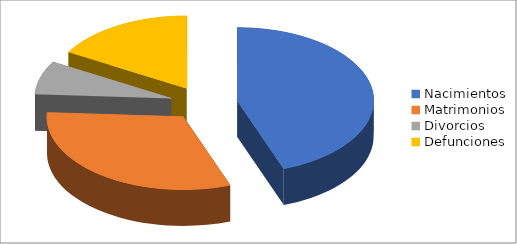
| Category | Series 0 |
|---|---|
| Nacimientos | 24 |
| Matrimonios | 17 |
| Divorcios | 4 |
| Defunciones | 9 |